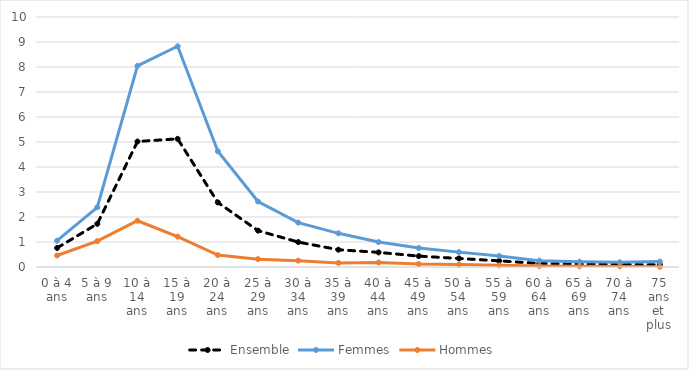
| Category | Ensemble | Femmes | Hommes |
|---|---|---|---|
| 0 à 4 ans | 0.762 | 1.051 | 0.461 |
| 5 à 9 ans | 1.726 | 2.388 | 1.034 |
| 10 à 14 ans | 5.019 | 8.047 | 1.85 |
| 15 à 19 ans | 5.126 | 8.829 | 1.214 |
| 20 à 24 ans | 2.582 | 4.629 | 0.478 |
| 25 à 29 ans | 1.454 | 2.618 | 0.314 |
| 30 à 34 ans | 0.998 | 1.777 | 0.255 |
| 35 à 39 ans | 0.691 | 1.347 | 0.165 |
| 40 à 44 ans | 0.584 | 0.997 | 0.182 |
| 45 à 49 ans | 0.435 | 0.76 | 0.118 |
| 50 à 54 ans | 0.341 | 0.595 | 0.097 |
| 55 à 59 ans | 0.247 | 0.439 | 0.066 |
| 60 à 64 ans | 0.141 | 0.252 | 0.041 |
| 65 à 69 ans | 0.116 | 0.211 | 0.031 |
| 70 à 74 ans | 0.1 | 0.188 | 0.023 |
| 75 ans et plus | 0.09 | 0.215 | 0.011 |